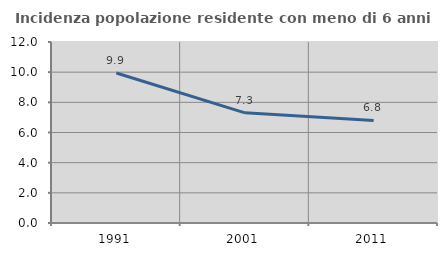
| Category | Incidenza popolazione residente con meno di 6 anni |
|---|---|
| 1991.0 | 9.946 |
| 2001.0 | 7.305 |
| 2011.0 | 6.803 |